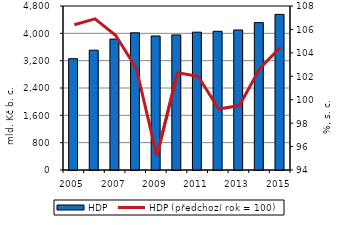
| Category | HDP |
|---|---|
| 2005.0 | 3258 |
| 2006.0 | 3507.1 |
| 2007.0 | 3831.8 |
| 2008.0 | 4015.3 |
| 2009.0 | 3921.8 |
| 2010.0 | 3953.7 |
| 2011.0 | 4033.8 |
| 2012.0 | 4059.9 |
| 2013.0 | 4098.1 |
| 2014.0 | 4313.8 |
| 2015.0 | 4554.6 |